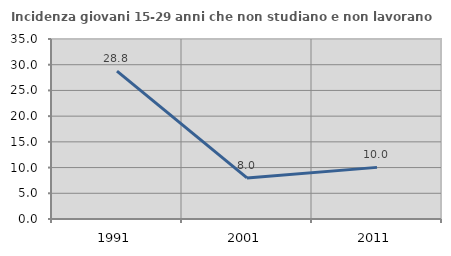
| Category | Incidenza giovani 15-29 anni che non studiano e non lavorano  |
|---|---|
| 1991.0 | 28.756 |
| 2001.0 | 7.986 |
| 2011.0 | 10.039 |